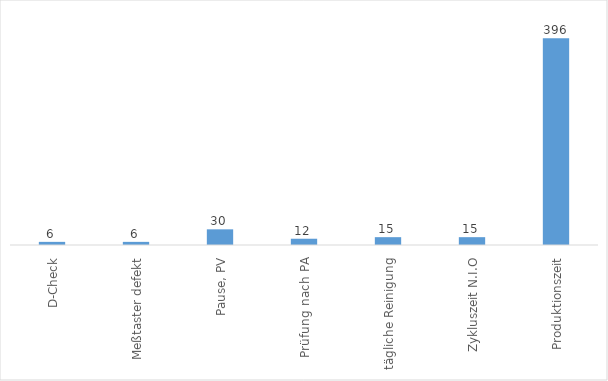
| Category | Series 0 |
|---|---|
| D-Check | 6 |
| Meßtaster defekt | 6 |
| Pause, PV | 30 |
| Prüfung nach PA | 12 |
| tägliche Reinigung | 15 |
| Zykluszeit N.I.O | 15 |
| Produktionszeit | 396 |